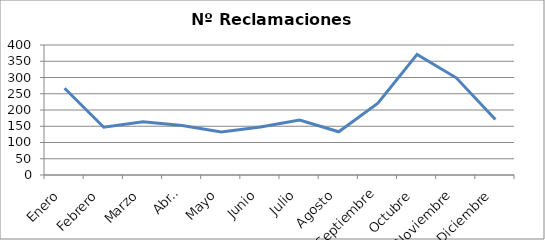
| Category | Nº Reclamaciones |
|---|---|
| Enero | 267 |
| Febrero | 147 |
| Marzo | 164 |
| Abril | 152 |
| Mayo | 132 |
| Junio | 148 |
| Julio | 169 |
| Agosto | 133 |
| Septiembre | 221 |
| Octubre | 371 |
| Noviembre | 299 |
| Diciembre | 171 |